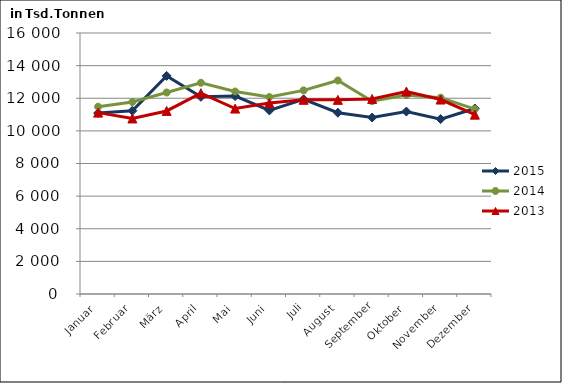
| Category | 2015 | 2014 | 2013 |
|---|---|---|---|
| Januar | 11089.371 | 11483.064 | 11119.399 |
| Februar | 11233.202 | 11771.027 | 10760.95 |
| März | 13370.037 | 12352.884 | 11221.318 |
| April | 12088.081 | 12947.646 | 12309.663 |
| Mai | 12130.812 | 12413.614 | 11367.286 |
| Juni | 11254.555 | 12074.912 | 11702.924 |
| Juli | 11934.829 | 12482.909 | 11905.804 |
| August | 11113.407 | 13089.657 | 11900.761 |
| September | 10817.107 | 11818.844 | 11955.163 |
| Oktober | 11183.561 | 12198.116 | 12414.086 |
| November | 10721.61 | 12033.776 | 11920.704 |
| Dezember | 11374.913 | 11333.697 | 10995.382 |